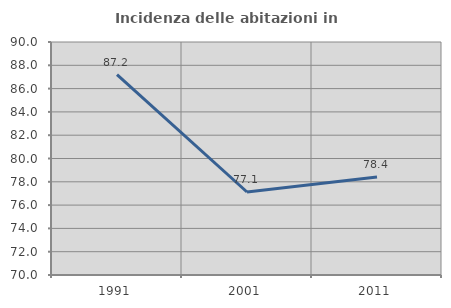
| Category | Incidenza delle abitazioni in proprietà  |
|---|---|
| 1991.0 | 87.205 |
| 2001.0 | 77.124 |
| 2011.0 | 78.416 |